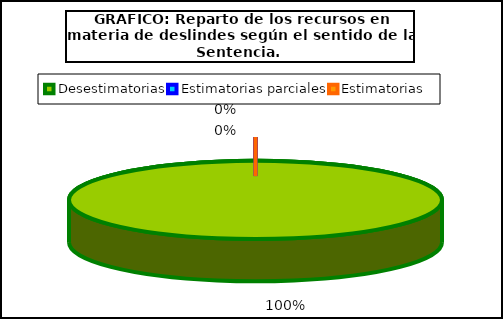
| Category | Número de recursos |
|---|---|
| Desestimatorias | 7 |
| Estimatorias parciales | 0 |
| Estimatorias  | 0 |